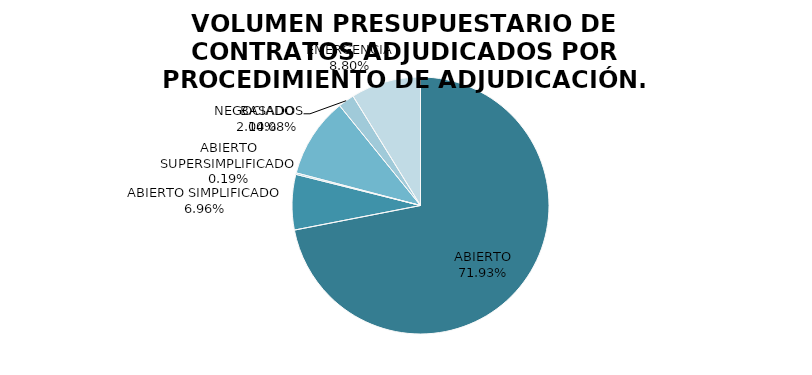
| Category | VALOR | % |
|---|---|---|
| ABIERTO | 29147631.87 | 71.933 |
| ABIERTO SIMPLIFICADO | 2820497.29 | 6.961 |
| ABIERTO SUPERSIMPLIFICADO | 76254.18 | 0.188 |
| BASADOS | 4083530.11 | 10.078 |
| NEGOCIADO  | 827163.98 | 2.041 |
| EMERGENCIA | 3565204.71 | 8.799 |